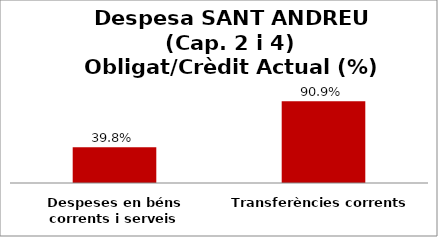
| Category | Series 0 |
|---|---|
| Despeses en béns corrents i serveis | 0.398 |
| Transferències corrents | 0.909 |